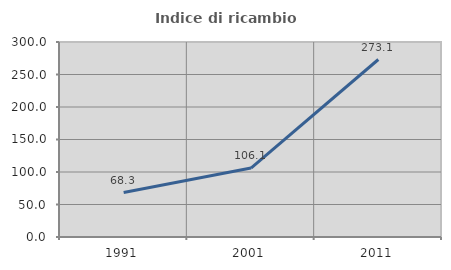
| Category | Indice di ricambio occupazionale  |
|---|---|
| 1991.0 | 68.321 |
| 2001.0 | 106.081 |
| 2011.0 | 273.077 |